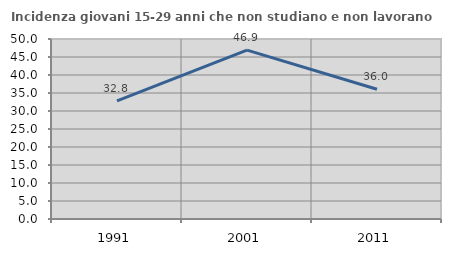
| Category | Incidenza giovani 15-29 anni che non studiano e non lavorano  |
|---|---|
| 1991.0 | 32.83 |
| 2001.0 | 46.908 |
| 2011.0 | 36.045 |